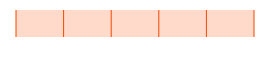
| Category | Dreiging van mogelijke toetreders |
|---|---|
| 0 | 0 |